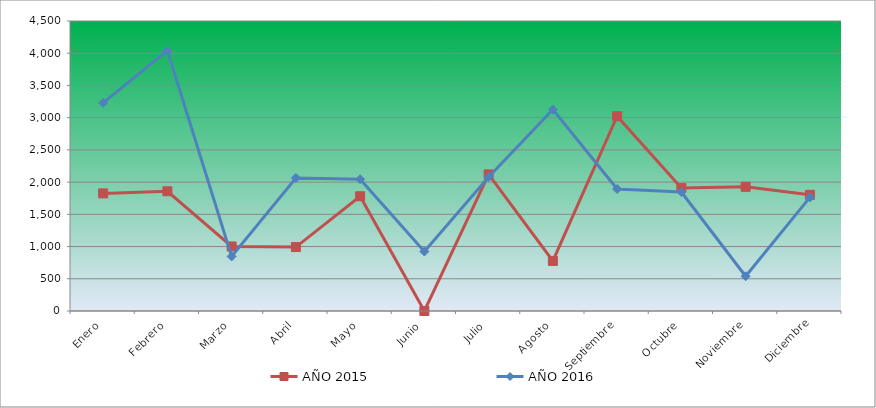
| Category | AÑO 2015 | AÑO 2016 |
|---|---|---|
| Enero | 1824.906 | 3229.672 |
| Febrero | 1857.827 | 4039.515 |
| Marzo | 1001.358 | 846.71 |
| Abril | 992 | 2064.45 |
| Mayo | 1780.453 | 2044.314 |
| Junio | 0 | 922.819 |
| Julio | 2120.302 | 2080.269 |
| Agosto | 776.755 | 3125.704 |
| Septiembre | 3022.087 | 1893.205 |
| Octubre | 1909.132 | 1845.637 |
| Noviembre | 1926.935 | 539.329 |
| Diciembre | 1802.546 | 1762.393 |